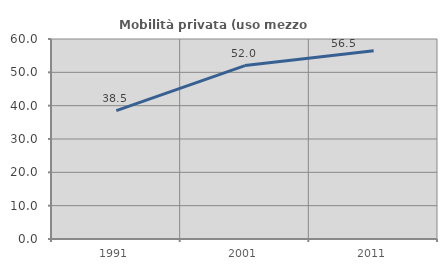
| Category | Mobilità privata (uso mezzo privato) |
|---|---|
| 1991.0 | 38.521 |
| 2001.0 | 52.032 |
| 2011.0 | 56.497 |